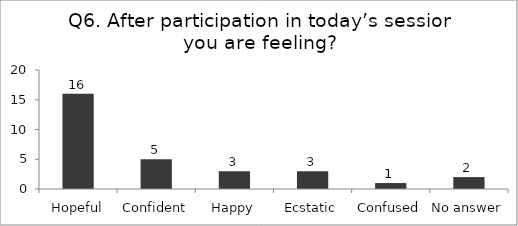
| Category | Q6. After participation in today’s session you are feeling? |
|---|---|
| Hopeful | 16 |
| Confident | 5 |
| Happy | 3 |
| Ecstatic | 3 |
| Confused | 1 |
| No answer | 2 |